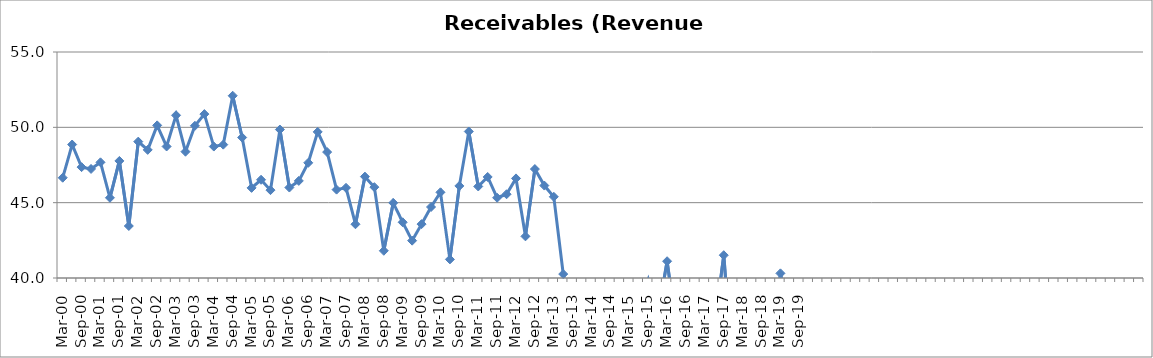
| Category | Receivables (Revenue Days) |
|---|---|
| Mar-00 | 46.655 |
| Jun-00 | 48.858 |
| Sep-00 | 47.358 |
| Dec-00 | 47.24 |
| Mar-01 | 47.678 |
| Jun-01 | 45.323 |
| Sep-01 | 47.77 |
| Dec-01 | 43.452 |
| Mar-02 | 49.051 |
| Jun-02 | 48.503 |
| Sep-02 | 50.13 |
| Dec-02 | 48.73 |
| Mar-03 | 50.799 |
| Jun-03 | 48.386 |
| Sep-03 | 50.101 |
| Dec-03 | 50.877 |
| Mar-04 | 48.724 |
| Jun-04 | 48.85 |
| Sep-04 | 52.096 |
| Dec-04 | 49.325 |
| Mar-05 | 45.981 |
| Jun-05 | 46.521 |
| Sep-05 | 45.832 |
| Dec-05 | 49.854 |
| Mar-06 | 46.004 |
| Jun-06 | 46.445 |
| Sep-06 | 47.647 |
| Dec-06 | 49.697 |
| Mar-07 | 48.357 |
| Jun-07 | 45.866 |
| Sep-07 | 45.986 |
| Dec-07 | 43.568 |
| Mar-08 | 46.728 |
| Jun-08 | 46.03 |
| Sep-08 | 41.807 |
| Dec-08 | 44.987 |
| Mar-09 | 43.698 |
| Jun-09 | 42.479 |
| Sep-09 | 43.575 |
| Dec-09 | 44.712 |
| Mar-10 | 45.688 |
| Jun-10 | 41.237 |
| Sep-10 | 46.111 |
| Dec-10 | 49.724 |
| Mar-11 | 46.074 |
| Jun-11 | 46.706 |
| Sep-11 | 45.326 |
| Dec-11 | 45.559 |
| Mar-12 | 46.61 |
| Jun-12 | 42.765 |
| Sep-12 | 47.23 |
| Dec-12 | 46.135 |
| Mar-13 | 45.39 |
| Jun-13 | 40.262 |
| Sep-13 | 37.161 |
| Dec-13 | 37.731 |
| Mar-14 | 39.32 |
| Jun-14 | 38.886 |
| Sep-14 | 36.611 |
| Dec-14 | 35.741 |
| Mar-15 | 36.973 |
| Jun-15 | 38.105 |
| Sep-15 | 39.898 |
| Dec-15 | 37.48 |
| Mar-16 | 41.112 |
| Jun-16 | 36.563 |
| Sep-16 | 34.535 |
| Dec-16 | 32.914 |
| Mar-17 | 38.904 |
| Jun-17 | 36.702 |
| Sep-17 | 41.512 |
| Dec-17 | 33.488 |
| Mar-18 | 37.185 |
| Jun-18 | 36.014 |
| Sep-18 | 34.711 |
| Dec-18 | 32.874 |
| Mar-19 | 40.309 |
| Jun-19 | 37.064 |
| Sep-19 | 35.23 |